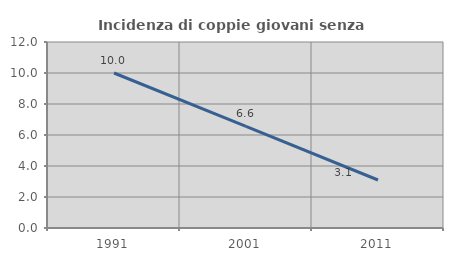
| Category | Incidenza di coppie giovani senza figli |
|---|---|
| 1991.0 | 10 |
| 2001.0 | 6.557 |
| 2011.0 | 3.097 |